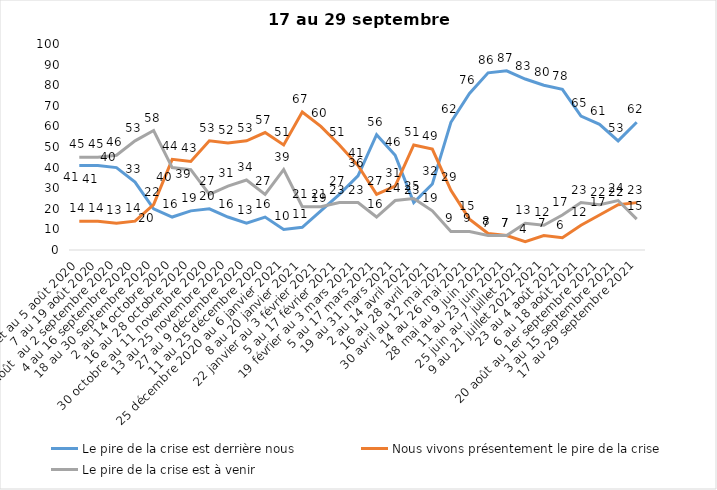
| Category | Le pire de la crise est derrière nous | Nous vivons présentement le pire de la crise | Le pire de la crise est à venir |
|---|---|---|---|
| 24 juillet au 5 août 2020 | 41 | 14 | 45 |
| 7 au 19 août 2020 | 41 | 14 | 45 |
| 21 août  au 2 septembre 2020 | 40 | 13 | 46 |
| 4 au 16 septembre 2020 | 33 | 14 | 53 |
| 18 au 30 septembre 2020 | 20 | 22 | 58 |
| 2 au 14 octobre 2020 | 16 | 44 | 40 |
| 16 au 28 octobre 2020 | 19 | 43 | 39 |
| 30 octobre au 11 novembre 2020 | 20 | 53 | 27 |
| 13 au 25 novembre 2020 | 16 | 52 | 31 |
| 27 au 9 décembre 2020 | 13 | 53 | 34 |
| 11 au 25 décembre 2020 | 16 | 57 | 27 |
| 25 décembre 2020 au 6 janvier 2021 | 10 | 51 | 39 |
| 8 au 20 janvier 2021 | 11 | 67 | 21 |
| 22 janvier au 3 février 2021 | 19 | 60 | 21 |
| 5 au 17 février 2021 | 27 | 51 | 23 |
| 19 février au 3 mars 2021 | 36 | 41 | 23 |
| 5 au 17 mars 2021 | 56 | 27 | 16 |
| 19 au 31 mars 2021 | 46 | 31 | 24 |
| 2 au 14 avril 2021 | 23 | 51 | 25 |
| 16 au 28 avril 2021 | 32 | 49 | 19 |
| 30 avril au 12 mai 2021 | 62 | 29 | 9 |
| 14 au 26 mai 2021 | 76 | 15 | 9 |
| 28 mai au 9 juin 2021 | 86 | 8 | 7 |
| 11 au 23 juin 2021 | 87 | 7 | 7 |
| 25 juin au 7 juillet 2021 | 83 | 4 | 13 |
| 9 au 21 juillet 2021 2021 | 80 | 7 | 12 |
| 23 au 4 août 2021 | 78 | 6 | 17 |
| 6 au 18 août 2021 | 65 | 12 | 23 |
| 20 août au 1er septembre 2021 | 61 | 17 | 22 |
| 3 au 15 septembre 2021 | 53 | 22 | 24 |
| 17 au 29 septembre 2021 | 62 | 23 | 15 |